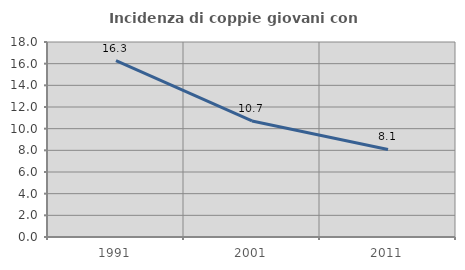
| Category | Incidenza di coppie giovani con figli |
|---|---|
| 1991.0 | 16.275 |
| 2001.0 | 10.714 |
| 2011.0 | 8.083 |